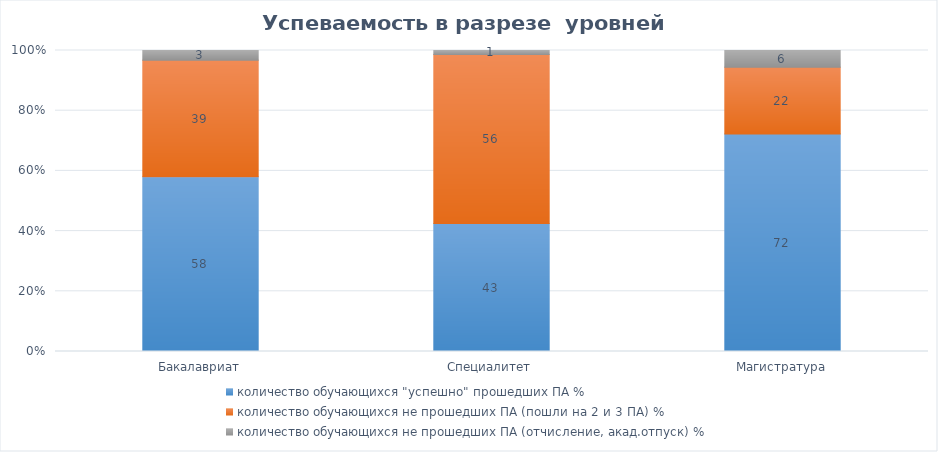
| Category | количество обучающихся "успешно" прошедших ПА % | количество обучающихся не прошедших ПА (пошли на 2 и 3 ПА) % | количество обучающихся не прошедших ПА (отчисление, акад.отпуск) % |
|---|---|---|---|
| Бакалавриат | 58.031 | 38.731 | 3.238 |
| Специалитет | 42.51 | 56.19 | 1.3 |
| Магистратура | 72.222 | 22.222 | 5.556 |